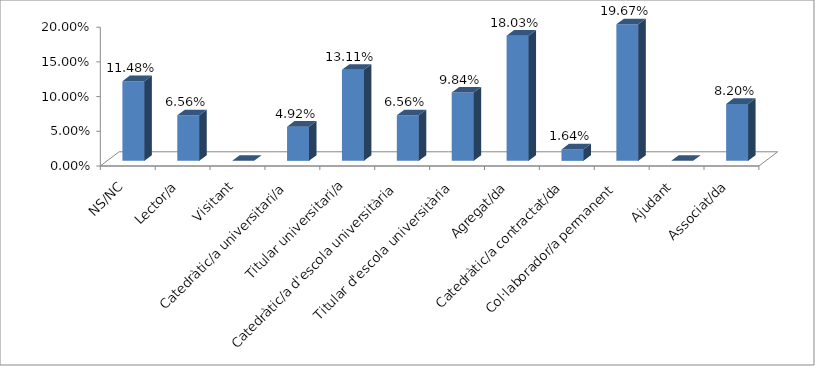
| Category | Series 0 |
|---|---|
| NS/NC | 0.115 |
| Lector/a | 0.066 |
| Visitant | 0 |
| Catedràtic/a universitari/a | 0.049 |
| Titular universitari/a | 0.131 |
| Catedràtic/a d'escola universitària | 0.066 |
| Titular d'escola universitària | 0.098 |
| Agregat/da | 0.18 |
| Catedràtic/a contractat/da | 0.016 |
| Col·laborador/a permanent | 0.197 |
| Ajudant | 0 |
| Associat/da | 0.082 |